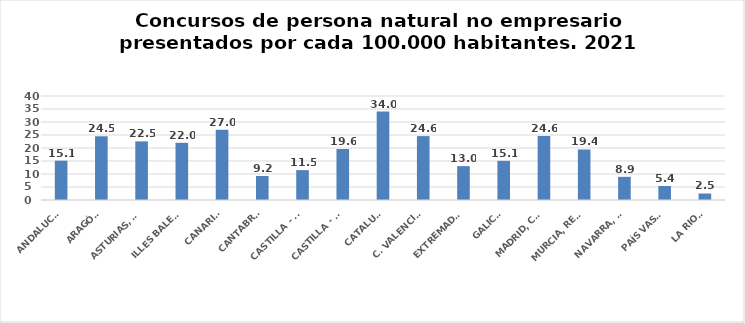
| Category | Series 0 |
|---|---|
| ANDALUCÍA | 15.123 |
| ARAGÓN | 24.505 |
| ASTURIAS, PRINCIPADO | 22.534 |
| ILLES BALEARS | 21.995 |
| CANARIAS | 27.014 |
| CANTABRIA | 9.239 |
| CASTILLA - LEÓN | 11.497 |
| CASTILLA - LA MANCHA | 19.614 |
| CATALUÑA | 34.032 |
| C. VALENCIANA | 24.574 |
| EXTREMADURA | 13.025 |
| GALICIA | 15.061 |
| MADRID, COMUNIDAD | 24.603 |
| MURCIA, REGIÓN | 19.427 |
| NAVARRA, COM. FORAL | 8.919 |
| PAÍS VASCO | 5.375 |
| LA RIOJA | 2.502 |